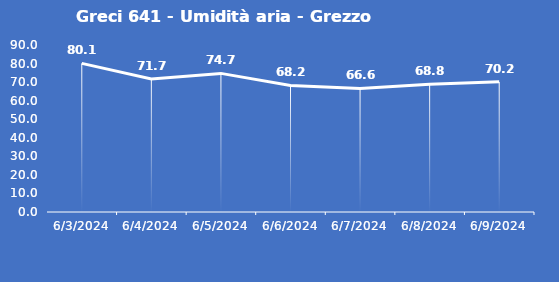
| Category | Greci 641 - Umidità aria - Grezzo (%) |
|---|---|
| 6/3/24 | 80.1 |
| 6/4/24 | 71.7 |
| 6/5/24 | 74.7 |
| 6/6/24 | 68.2 |
| 6/7/24 | 66.6 |
| 6/8/24 | 68.8 |
| 6/9/24 | 70.2 |